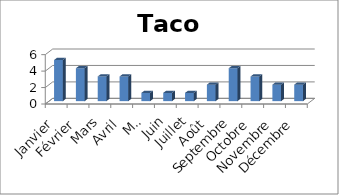
| Category | Taco |
|---|---|
| Janvier | 5 |
| Février | 4 |
| Mars | 3 |
| Avril | 3 |
| Mai | 1 |
| Juin | 1 |
| Juillet | 1 |
| Août | 2 |
| Septembre | 4 |
| Octobre | 3 |
| Novembre | 2 |
| Décembre | 2 |